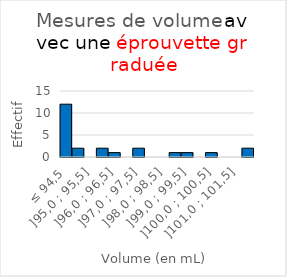
| Category | ≤ 94,5 |
|---|---|
| ≤ 94,5 | 12 |
| ]94,5 ; 95,0] | 2 |
| ]95,0 ; 95,5] | 0 |
| ]95,5 ; 96,0] | 2 |
| ]96,0 ; 96,5] | 1 |
| ]96,5 ; 97,0] | 0 |
| ]97,0 ; 97,5] | 2 |
| ]97,5 ; 98,0] | 0 |
| ]98,0 ; 98,5] | 0 |
| ]98,5 ; 99,0] | 1 |
| ]99,0 ; 99,5] | 1 |
| ]99,5 ; 100,0] | 0 |
| ]100,0 ; 100,5] | 1 |
| ]100,5 ; 101,0] | 0 |
| ]101,0 ; 101,5] | 0 |
| > 101,5 | 2 |